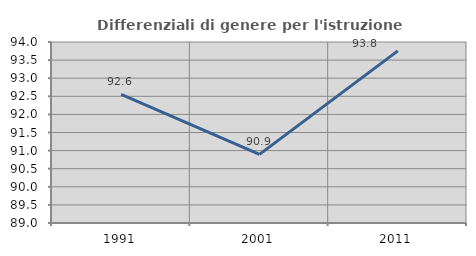
| Category | Differenziali di genere per l'istruzione superiore |
|---|---|
| 1991.0 | 92.553 |
| 2001.0 | 90.896 |
| 2011.0 | 93.754 |